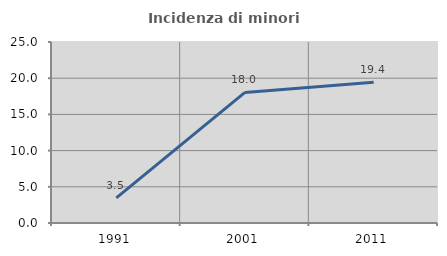
| Category | Incidenza di minori stranieri |
|---|---|
| 1991.0 | 3.468 |
| 2001.0 | 18.033 |
| 2011.0 | 19.429 |